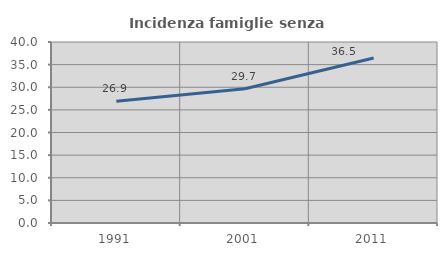
| Category | Incidenza famiglie senza nuclei |
|---|---|
| 1991.0 | 26.907 |
| 2001.0 | 29.667 |
| 2011.0 | 36.458 |